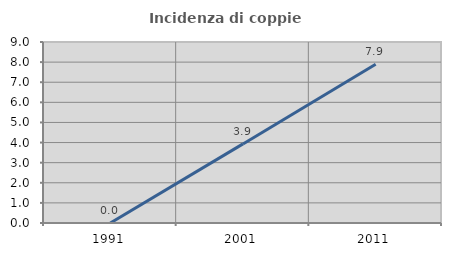
| Category | Incidenza di coppie miste |
|---|---|
| 1991.0 | 0 |
| 2001.0 | 3.933 |
| 2011.0 | 7.895 |